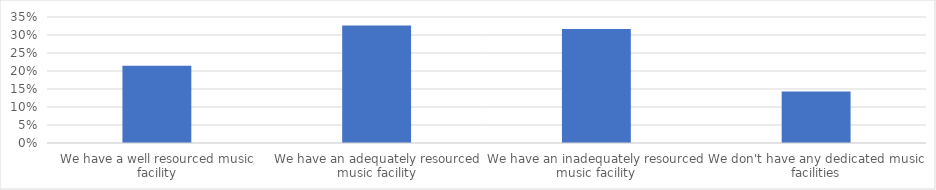
| Category | % of Respondents |
|---|---|
| We have a well resourced music facility | 0.214 |
| We have an adequately resourced music facility | 0.327 |
| We have an inadequately resourced music facility | 0.316 |
| We don't have any dedicated music facilities | 0.143 |